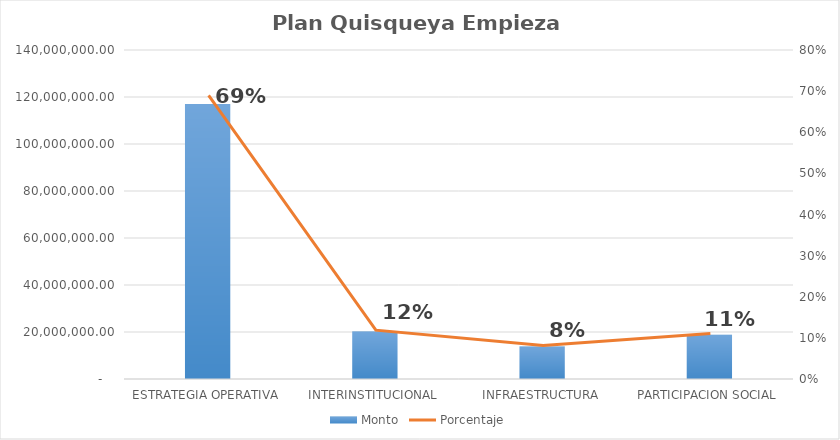
| Category | Monto |
|---|---|
| ESTRATEGIA OPERATIVA | 117074370.52 |
| INTERINSTITUCIONAL | 20166235 |
| INFRAESTRUCTURA | 13791910 |
| PARTICIPACION SOCIAL | 18790570 |